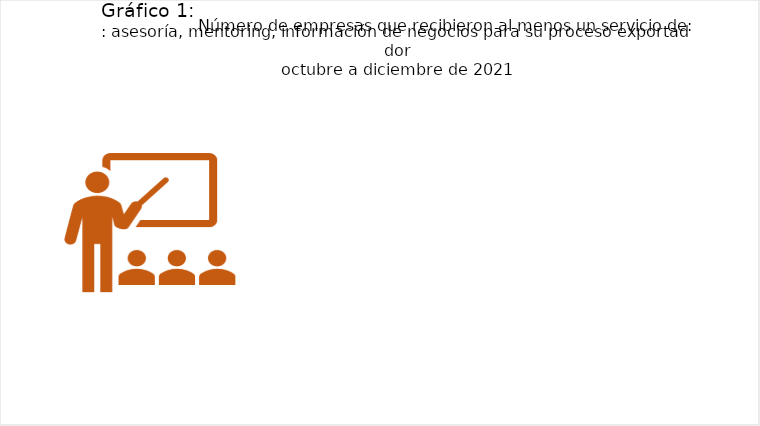
| Category | Número de empresas atendidas con servicios de: Asesoría y mentoring, contactos de negocios, plan de acción para la exportación, evaluación para la exportación  |
|---|---|
| octubre | 48 |
| noviembre | 28 |
| diciembre | 30 |